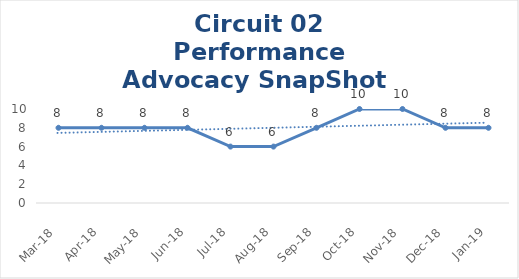
| Category | Circuit 02 |
|---|---|
| Mar-18 | 8 |
| Apr-18 | 8 |
| May-18 | 8 |
| Jun-18 | 8 |
| Jul-18 | 6 |
| Aug-18 | 6 |
| Sep-18 | 8 |
| Oct-18 | 10 |
| Nov-18 | 10 |
| Dec-18 | 8 |
| Jan-19 | 8 |